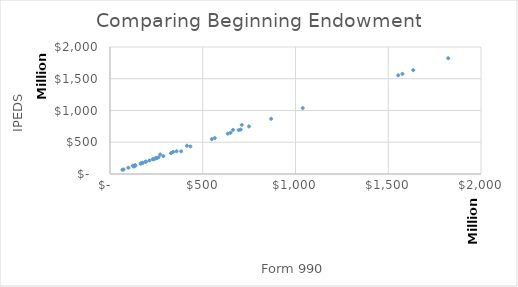
| Category | Series 0 |
|---|---|
| 270558942.0 | 306219000 |
| 710428368.0 | 773828000 |
| 414542107.0 | 444603000 |
| 122472260.0 | 129080566 |
| 663324373.0 | 694311000 |
| 339789723.0 | 348138423 |
| 129759886.0 | 131812369 |
| 193161995.0 | 195216515 |
| 564626876.0 | 566028827 |
| 433261211.0 | 434233554 |
| 167608000.0 | 167609000 |
| 1576336888.0 | 1576337000 |
| 634912204.0 | 634912206 |
| 251001216.0 | 251001216 |
| 240710000.0 | 240710000 |
| 233803986.0 | 233803986 |
| 1038640000.0 | 1038640000 |
| 231243960.0 | 231243960 |
| 649992000.0 | 649992000 |
| 66999430.0 | 66999430 |
| 549015343.0 | 549015343 |
| 261569952.0 | 261569952 |
| 136789516.0 | 136789516 |
| 192294969.0 | 192294969 |
| 98752347.0 | 98752347 |
| 749031061.0 | 749031061 |
| 212431926.0 | 212431926 |
| 252949637.0 | 252949637 |
| 1634685000.0 | 1634685000 |
| 247092897.0 | 247092897 |
| 176062312.0 | 176062312 |
| 1553629299.0 | 1553629000 |
| 1823441482.0 | 1823441000 |
| 868744442.0 | 868741153 |
| 358608739.0 | 358600000 |
| 693709382.0 | 691739982 |
| 328779797.0 | 327171376 |
| 704714660.0 | 700540278 |
| 164309138.0 | 162801245 |
| 135681072.0 | 134228145 |
| 175131823.0 | 173147287 |
| 287855306.0 | 282289240 |
| 73286802.0 | 71227447 |
| 383627404.0 | 356738667 |
| 129711883.0 | 117227267 |
| 2105519441.0 | 1823748203 |